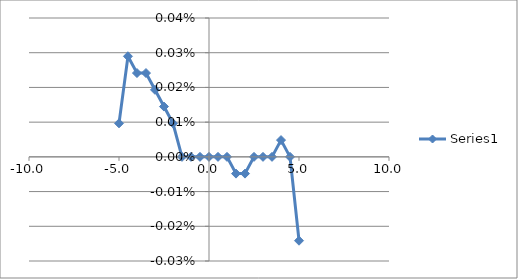
| Category | Series 0 |
|---|---|
| -5.0 | 0 |
| -4.501999999999999 | 0 |
| -4.001999999999999 | 0 |
| -3.5009999999999994 | 0 |
| -3.0009999999999994 | 0 |
| -2.5009999999999994 | 0 |
| -2.0009999999999994 | 0 |
| -1.5009999999999994 | 0 |
| -1.0009999999999994 | 0 |
| -0.5010000000000012 | 0 |
| -0.0010000000000012221 | 0 |
| 0.5 | 0 |
| 1.0 | 0 |
| 1.5 | 0 |
| 2.0 | 0 |
| 2.5 | 0 |
| 3.0 | 0 |
| 3.5010000000000012 | 0 |
| 4.001000000000001 | 0 |
| 4.501000000000001 | 0 |
| 5.001000000000001 | 0 |